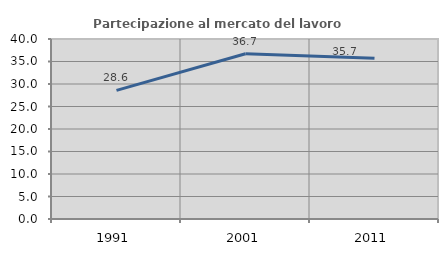
| Category | Partecipazione al mercato del lavoro  femminile |
|---|---|
| 1991.0 | 28.571 |
| 2001.0 | 36.735 |
| 2011.0 | 35.714 |